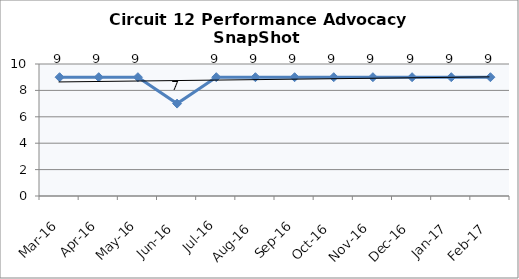
| Category | Circuit 12 |
|---|---|
| Mar-16 | 9 |
| Apr-16 | 9 |
| May-16 | 9 |
| Jun-16 | 7 |
| Jul-16 | 9 |
| Aug-16 | 9 |
| Sep-16 | 9 |
| Oct-16 | 9 |
| Nov-16 | 9 |
| Dec-16 | 9 |
| Jan-17 | 9 |
| Feb-17 | 9 |